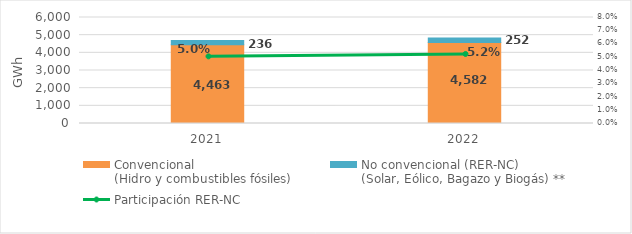
| Category | Convencional
(Hidro y combustibles fósiles) | No convencional (RER-NC)
(Solar, Eólico, Bagazo y Biogás) ** |
|---|---|---|
| 2021.0 | 4462.894 | 236.347 |
| 2022.0 | 4581.869 | 251.838 |